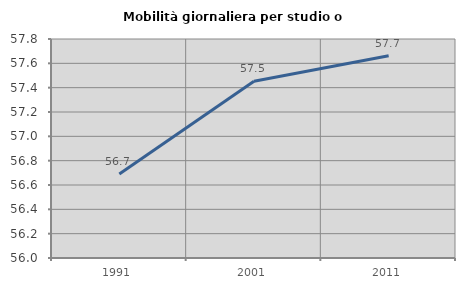
| Category | Mobilità giornaliera per studio o lavoro |
|---|---|
| 1991.0 | 56.69 |
| 2001.0 | 57.453 |
| 2011.0 | 57.663 |